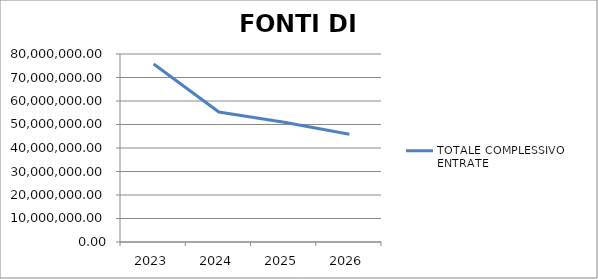
| Category | TOTALE COMPLESSIVO ENTRATE |
|---|---|
| 2023.0 | 75724054.89 |
| 2024.0 | 55323176.01 |
| 2025.0 | 50944024.63 |
| 2026.0 | 45879164.26 |